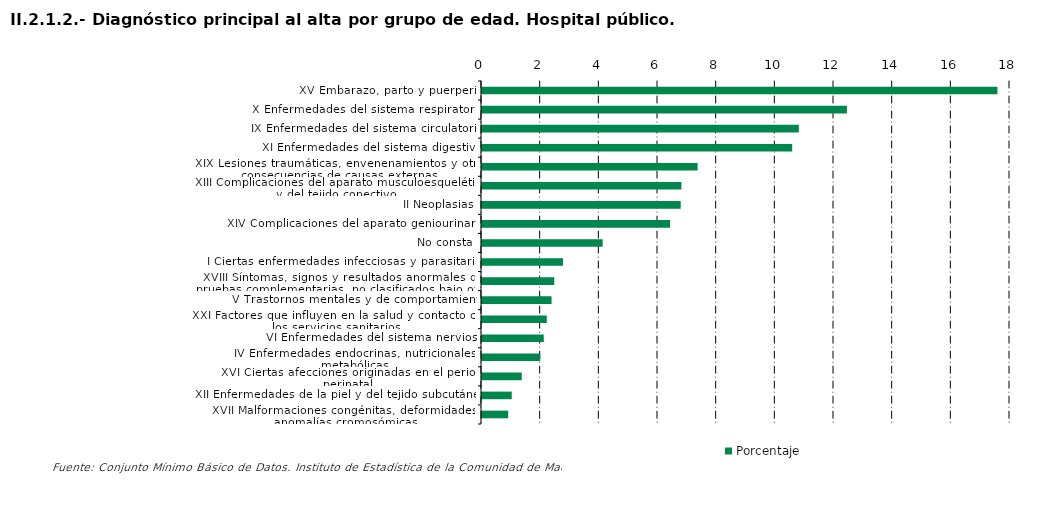
| Category | Porcentaje |
|---|---|
| XV Embarazo, parto y puerperio | 17.573 |
| X Enfermedades del sistema respiratorio | 12.44 |
| IX Enfermedades del sistema circulatorio | 10.802 |
| XI Enfermedades del sistema digestivo | 10.574 |
| XIX Lesiones traumáticas, envenenamientos y otras consecuencias de causas externas | 7.351 |
| XIII Complicaciones del aparato musculoesquelético y del tejido conectivo | 6.798 |
| II Neoplasias | 6.773 |
| XIV Complicaciones del aparato geniourinario | 6.413 |
| No consta | 4.114 |
| I Ciertas enfermedades infecciosas y parasitarias | 2.761 |
| XVIII Síntomas, signos y resultados anormales de pruebas complementarias, no clasificados bajo otro concepto | 2.464 |
| V Trastornos mentales y de comportamiento | 2.372 |
| XXI Factores que influyen en la salud y contacto con los servicios sanitarios | 2.208 |
| VI Enfermedades del sistema nervioso | 2.106 |
| IV Enfermedades endocrinas, nutricionales y metabólicas | 1.987 |
| XVI Ciertas afecciones originadas en el periodo perinatal | 1.355 |
| XII Enfermedades de la piel y del tejido subcutáneo | 1.014 |
| XVII Malformaciones congénitas, deformidades y anomalías cromosómicas | 0.894 |